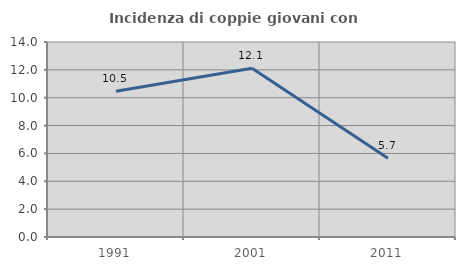
| Category | Incidenza di coppie giovani con figli |
|---|---|
| 1991.0 | 10.465 |
| 2001.0 | 12.121 |
| 2011.0 | 5.66 |